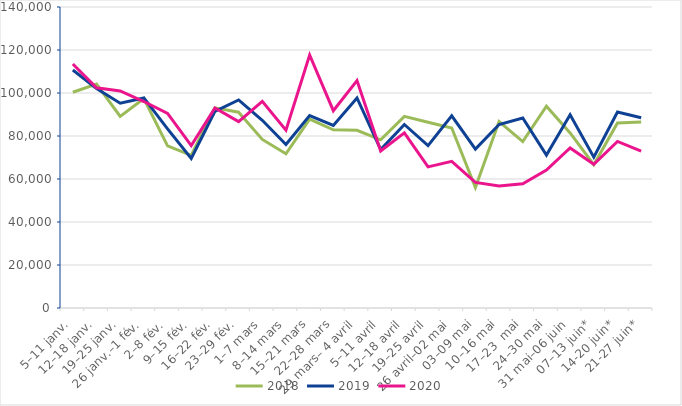
| Category | 2018 | 2019 | 2020 |
|---|---|---|---|
| 5–11 janv. | 100330 | 110701 | 113506 |
| 12–18 janv. | 104190 | 102045 | 102407 |
| 19–25 janv. | 89142 | 95260 | 100966 |
| 26 janv.–1 fév. | 97441 | 97699 | 96042 |
| 2–8 fév. | 75434 | 83347 | 90495 |
| 9–15 fév. | 71031 | 69559 | 75523 |
| 16–22 fév. | 93102 | 91428 | 93003 |
| 23–29 fév. | 91065 | 96774 | 86699 |
| 1–7 mars | 78415 | 87314 | 96119 |
| 8–14 mars | 71697 | 76021 | 82690 |
| 15–21 mars | 87845 | 89536 | 117673 |
| 22–28 mars | 82895 | 84912 | 91763.636 |
| 29 mars– 4 avril | 82654 | 97699 | 105802 |
| 5–11 avril | 78244 | 73699 | 73060.606 |
| 12–18 avril | 89129 | 85348 | 81477 |
| 19–25 avril | 86398 | 75509 | 65653 |
| 26 avril–02 mai | 83743 | 89413 | 68188 |
| 03–09 mai | 56008 | 73891 | 58423 |
| 10–16 mai | 86722 | 85364 | 56762 |
| 17–23  mai | 77423 | 88345 | 57817 |
| 24–30 mai | 93888 | 71115 | 64117 |
| 31 mai–06 juin | 81416 | 89880 | 74412 |
| 07–13 juin* | 66658 | 70150 | 66851 |
| 14-20 juin* | 86057 | 91157 | 77461 |
| 21-27 juin* | 86474 | 88454 | 72920 |